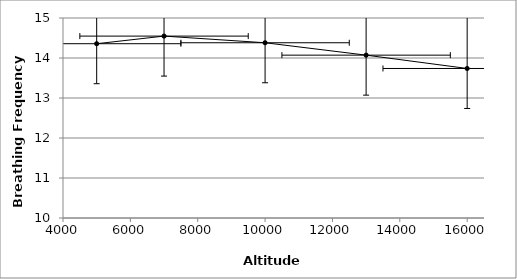
| Category | Series 0 |
|---|---|
| 5000.0 | 14.357 |
| 7000.0 | 14.548 |
| 10000.0 | 14.381 |
| 13000.0 | 14.071 |
| 16000.0 | 13.738 |